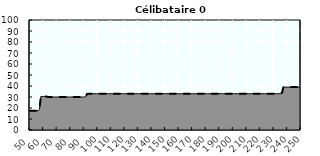
| Category | Coin fiscal marginal (somme des composantes) | Taux d’imposition marginal net |
|---|---|---|
| 50.0 | 17.5 | 17.5 |
| 51.0 | 17.5 | 17.5 |
| 52.0 | 17.5 | 17.5 |
| 53.0 | 17.5 | 17.5 |
| 54.0 | 17.5 | 17.5 |
| 55.0 | 17.5 | 17.5 |
| 56.0 | 17.5 | 17.5 |
| 57.0 | 18.878 | 18.878 |
| 58.0 | 30.5 | 30.5 |
| 59.0 | 30.5 | 30.5 |
| 60.0 | 30.5 | 30.5 |
| 61.0 | 30.5 | 30.5 |
| 62.0 | 30.5 | 30.5 |
| 63.0 | 30.079 | 30.079 |
| 64.0 | 30 | 30 |
| 65.0 | 30 | 30 |
| 66.0 | 30 | 30 |
| 67.0 | 30 | 30 |
| 68.0 | 30 | 30 |
| 69.0 | 30 | 30 |
| 70.0 | 30 | 30 |
| 71.0 | 30 | 30 |
| 72.0 | 30 | 30 |
| 73.0 | 30 | 30 |
| 74.0 | 30 | 30 |
| 75.0 | 30 | 30 |
| 76.0 | 30 | 30 |
| 77.0 | 30 | 30 |
| 78.0 | 30 | 30 |
| 79.0 | 30 | 30 |
| 80.0 | 30 | 30 |
| 81.0 | 30 | 30 |
| 82.0 | 30 | 30 |
| 83.0 | 30 | 30 |
| 84.0 | 30 | 30 |
| 85.0 | 30 | 30 |
| 86.0 | 30 | 30 |
| 87.0 | 30 | 30 |
| 88.0 | 30 | 30 |
| 89.0 | 30 | 30 |
| 90.0 | 30 | 30 |
| 91.0 | 30 | 30 |
| 92.0 | 32.688 | 32.688 |
| 93.0 | 33 | 33 |
| 94.0 | 33 | 33 |
| 95.0 | 33 | 33 |
| 96.0 | 33 | 33 |
| 97.0 | 33 | 33 |
| 98.0 | 33 | 33 |
| 99.0 | 33 | 33 |
| 100.0 | 33 | 33 |
| 101.0 | 33 | 33 |
| 102.0 | 33 | 33 |
| 103.0 | 33 | 33 |
| 104.0 | 33 | 33 |
| 105.0 | 33 | 33 |
| 106.0 | 33 | 33 |
| 107.0 | 33 | 33 |
| 108.0 | 33 | 33 |
| 109.0 | 33 | 33 |
| 110.0 | 33 | 33 |
| 111.0 | 33 | 33 |
| 112.0 | 33 | 33 |
| 113.0 | 33 | 33 |
| 114.0 | 33 | 33 |
| 115.0 | 33 | 33 |
| 116.0 | 33 | 33 |
| 117.0 | 33 | 33 |
| 118.0 | 33 | 33 |
| 119.0 | 33 | 33 |
| 120.0 | 33 | 33 |
| 121.0 | 33 | 33 |
| 122.0 | 33 | 33 |
| 123.0 | 33 | 33 |
| 124.0 | 33 | 33 |
| 125.0 | 33 | 33 |
| 126.0 | 33 | 33 |
| 127.0 | 33 | 33 |
| 128.0 | 33 | 33 |
| 129.0 | 33 | 33 |
| 130.0 | 33 | 33 |
| 131.0 | 33 | 33 |
| 132.0 | 33 | 33 |
| 133.0 | 33 | 33 |
| 134.0 | 33 | 33 |
| 135.0 | 33 | 33 |
| 136.0 | 33 | 33 |
| 137.0 | 33 | 33 |
| 138.0 | 33 | 33 |
| 139.0 | 33 | 33 |
| 140.0 | 33 | 33 |
| 141.0 | 33 | 33 |
| 142.0 | 33 | 33 |
| 143.0 | 33 | 33 |
| 144.0 | 33 | 33 |
| 145.0 | 33 | 33 |
| 146.0 | 33 | 33 |
| 147.0 | 33 | 33 |
| 148.0 | 33 | 33 |
| 149.0 | 33 | 33 |
| 150.0 | 33 | 33 |
| 151.0 | 33 | 33 |
| 152.0 | 33 | 33 |
| 153.0 | 33 | 33 |
| 154.0 | 33 | 33 |
| 155.0 | 33 | 33 |
| 156.0 | 33 | 33 |
| 157.0 | 33 | 33 |
| 158.0 | 33 | 33 |
| 159.0 | 33 | 33 |
| 160.0 | 33 | 33 |
| 161.0 | 33 | 33 |
| 162.0 | 33 | 33 |
| 163.0 | 33 | 33 |
| 164.0 | 33 | 33 |
| 165.0 | 33 | 33 |
| 166.0 | 33 | 33 |
| 167.0 | 33 | 33 |
| 168.0 | 33 | 33 |
| 169.0 | 33 | 33 |
| 170.0 | 33 | 33 |
| 171.0 | 33 | 33 |
| 172.0 | 33 | 33 |
| 173.0 | 33 | 33 |
| 174.0 | 33 | 33 |
| 175.0 | 33 | 33 |
| 176.0 | 33 | 33 |
| 177.0 | 33 | 33 |
| 178.0 | 33 | 33 |
| 179.0 | 33 | 33 |
| 180.0 | 33 | 33 |
| 181.0 | 33 | 33 |
| 182.0 | 33 | 33 |
| 183.0 | 33 | 33 |
| 184.0 | 33 | 33 |
| 185.0 | 33 | 33 |
| 186.0 | 33 | 33 |
| 187.0 | 33 | 33 |
| 188.0 | 33 | 33 |
| 189.0 | 33 | 33 |
| 190.0 | 33 | 33 |
| 191.0 | 33 | 33 |
| 192.0 | 33 | 33 |
| 193.0 | 33 | 33 |
| 194.0 | 33 | 33 |
| 195.0 | 33 | 33 |
| 196.0 | 33 | 33 |
| 197.0 | 33 | 33 |
| 198.0 | 33 | 33 |
| 199.0 | 33 | 33 |
| 200.0 | 33 | 33 |
| 201.0 | 33 | 33 |
| 202.0 | 33 | 33 |
| 203.0 | 33 | 33 |
| 204.0 | 33 | 33 |
| 205.0 | 33 | 33 |
| 206.0 | 33 | 33 |
| 207.0 | 33 | 33 |
| 208.0 | 33 | 33 |
| 209.0 | 33 | 33 |
| 210.0 | 33 | 33 |
| 211.0 | 33 | 33 |
| 212.0 | 33 | 33 |
| 213.0 | 33 | 33 |
| 214.0 | 33 | 33 |
| 215.0 | 33 | 33 |
| 216.0 | 33 | 33 |
| 217.0 | 33 | 33 |
| 218.0 | 33 | 33 |
| 219.0 | 33 | 33 |
| 220.0 | 33 | 33 |
| 221.0 | 33 | 33 |
| 222.0 | 33 | 33 |
| 223.0 | 33 | 33 |
| 224.0 | 33 | 33 |
| 225.0 | 33 | 33 |
| 226.0 | 33 | 33 |
| 227.0 | 33 | 33 |
| 228.0 | 33 | 33 |
| 229.0 | 33 | 33 |
| 230.0 | 33 | 33 |
| 231.0 | 33 | 33 |
| 232.0 | 33 | 33 |
| 233.0 | 33 | 33 |
| 234.0 | 33 | 33 |
| 235.0 | 33 | 33 |
| 236.0 | 33.966 | 33.966 |
| 237.0 | 39 | 39 |
| 238.0 | 39 | 39 |
| 239.0 | 39 | 39 |
| 240.0 | 39 | 39 |
| 241.0 | 39 | 39 |
| 242.0 | 39 | 39 |
| 243.0 | 39 | 39 |
| 244.0 | 39 | 39 |
| 245.0 | 39 | 39 |
| 246.0 | 39 | 39 |
| 247.0 | 39 | 39 |
| 248.0 | 39 | 39 |
| 249.0 | 39 | 39 |
| 250.0 | 39 | 39 |